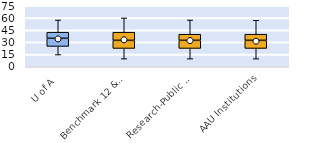
| Category | 25th | 50th | 75th |
|---|---|---|---|
| U of A | 25 | 10 | 7.5 |
| Benchmark 12 & SEC | 22.5 | 10 | 10 |
| Research-Public Univ | 22.5 | 10 | 7.5 |
| AAU Institutions | 22.5 | 10 | 7.5 |